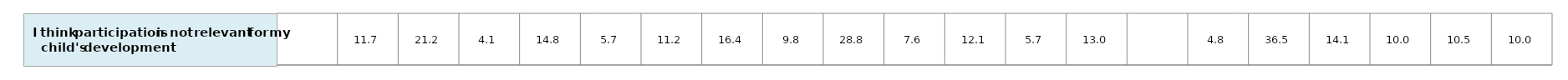
| Category | #REF! |
|---|---|
| nan | 1 |
| 11.71251091791724 | 1 |
| 21.21337126625756 | 1 |
| 4.06312911736462 | 1 |
| 14.77333199151167 | 1 |
| 5.70068012967477 | 1 |
| 11.15475980123468 | 1 |
| 16.41447548371332 | 1 |
| 9.81952311718208 | 1 |
| 28.784392667108026 | 1 |
| 7.55046002500927 | 1 |
| 12.08887624441833 | 1 |
| 5.7099036496541595 | 1 |
| 13.049154298204511 | 1 |
| nan | 1 |
| 4.79519837286804 | 1 |
| 36.52817493673239 | 1 |
| 14.06560557214895 | 1 |
| 10.04458776899723 | 1 |
| 10.45352559305654 | 1 |
| 10.01227071283235 | 1 |